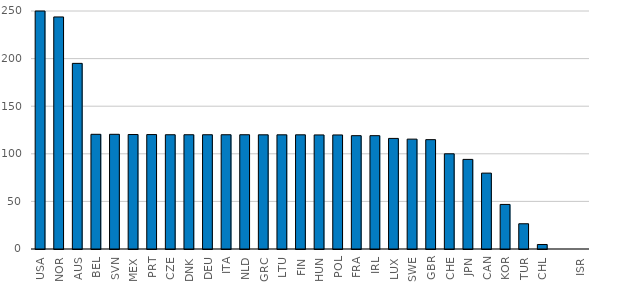
| Category | Series 0 |
|---|---|
| USA | 250 |
| NOR | 243.754 |
| AUS | 195 |
| BEL | 120.482 |
| SVN | 120.482 |
| MEX | 120.254 |
| PRT | 120.192 |
| CZE | 120.02 |
| DNK | 120.019 |
| DEU | 120.019 |
| ITA | 120.019 |
| NLD | 120.019 |
| GRC | 119.933 |
| LTU | 119.933 |
| FIN | 119.93 |
| HUN | 119.828 |
| POL | 119.809 |
| FRA | 119.048 |
| IRL | 119.048 |
| LUX | 116.158 |
| SWE | 115.401 |
| GBR | 114.865 |
| CHE | 100 |
| JPN | 94.127 |
| CAN | 79.713 |
| KOR | 46.816 |
| TUR | 26.512 |
| CHL | 4.738 |
|  | 0 |
| ISR | 0 |